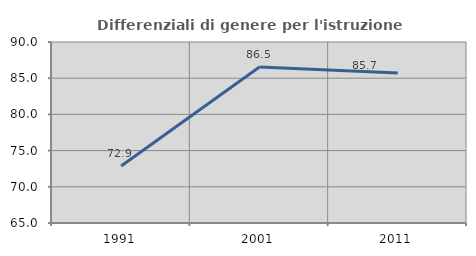
| Category | Differenziali di genere per l'istruzione superiore |
|---|---|
| 1991.0 | 72.862 |
| 2001.0 | 86.548 |
| 2011.0 | 85.73 |